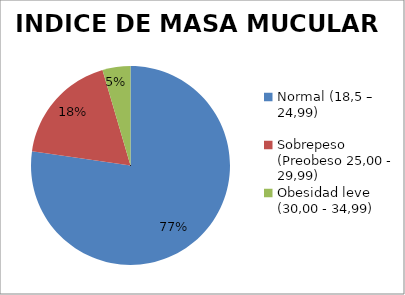
| Category | No. Trabajadores |
|---|---|
| Normal (18,5 – 24,99) | 17 |
| Sobrepeso (Preobeso 25,00 - 29,99) | 4 |
| Obesidad leve (30,00 - 34,99) | 1 |